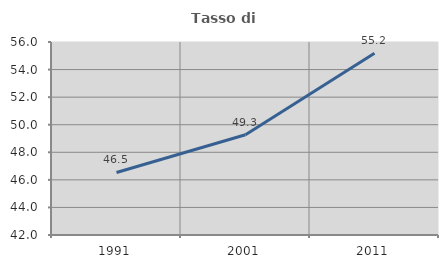
| Category | Tasso di occupazione   |
|---|---|
| 1991.0 | 46.536 |
| 2001.0 | 49.269 |
| 2011.0 | 55.18 |